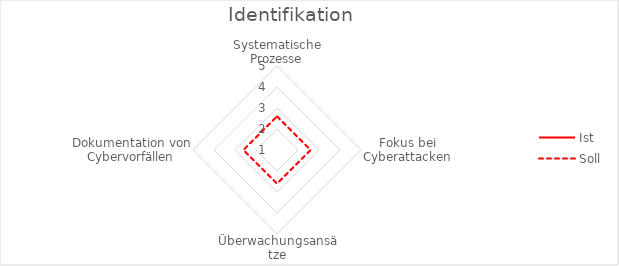
| Category | Ist | Soll |
|---|---|---|
| Systematische Prozesse | 1 | 2.6 |
| Fokus bei Cyberattacken | 1 | 2.6 |
| Überwachungsansätze | 1 | 2.6 |
| Dokumentation von Cybervorfällen | 1 | 2.6 |